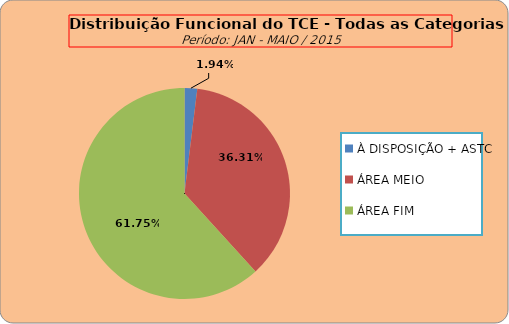
| Category | ÁREAS DE ATUAÇÃO |
|---|---|
| À DISPOSIÇÃO + ASTC | 10 |
| ÁREA MEIO | 187 |
| ÁREA FIM | 318 |